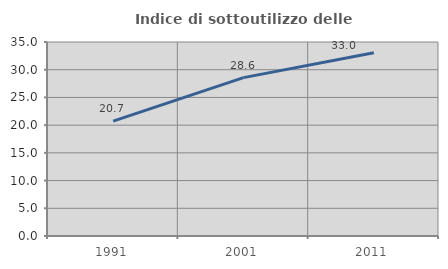
| Category | Indice di sottoutilizzo delle abitazioni  |
|---|---|
| 1991.0 | 20.732 |
| 2001.0 | 28.571 |
| 2011.0 | 33.043 |